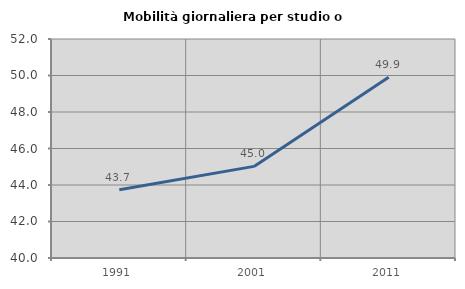
| Category | Mobilità giornaliera per studio o lavoro |
|---|---|
| 1991.0 | 43.743 |
| 2001.0 | 45.02 |
| 2011.0 | 49.907 |